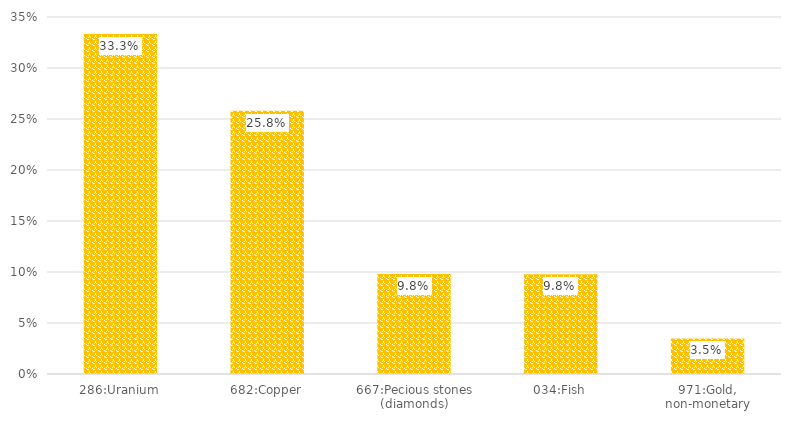
| Category | %Share |
|---|---|
| 286:Uranium | 0.333 |
| 682:Copper | 0.258 |
| 667:Pecious stones (diamonds) | 0.098 |
| 034:Fish | 0.098 |
| 971:Gold, non-monetary | 0.035 |